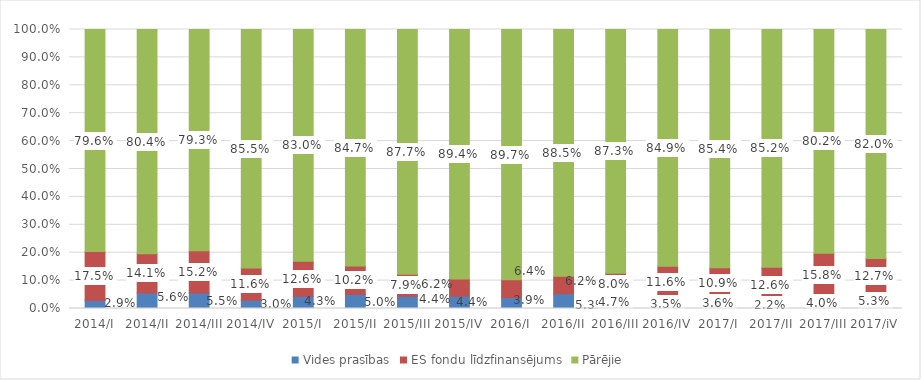
| Category | Vides prasības | ES fondu līdzfinansējums | Pārējie |
|---|---|---|---|
| 2014/I | 0.029 | 0.175 | 0.796 |
| 2014/II | 0.056 | 0.141 | 0.804 |
| 2014/III | 0.055 | 0.152 | 0.793 |
| 2014/IV | 0.03 | 0.116 | 0.855 |
| 2015/I | 0.043 | 0.126 | 0.83 |
| 2015/II | 0.05 | 0.102 | 0.847 |
| 2015/III | 0.044 | 0.079 | 0.877 |
| 2015/IV | 0.044 | 0.062 | 0.894 |
| 2016/I | 0.039 | 0.064 | 0.897 |
| 2016/II | 0.053 | 0.062 | 0.885 |
| 2016/III | 0.047 | 0.08 | 0.873 |
| 2016/IV | 0.035 | 0.116 | 0.849 |
| 2017/I | 0.036 | 0.109 | 0.854 |
| 2017/II | 0.022 | 0.126 | 0.852 |
| 2017/III | 0.04 | 0.158 | 0.802 |
| 2017/iV | 0.053 | 0.127 | 0.82 |